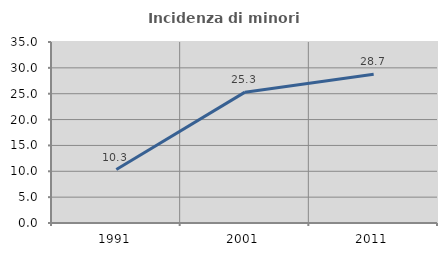
| Category | Incidenza di minori stranieri |
|---|---|
| 1991.0 | 10.345 |
| 2001.0 | 25.301 |
| 2011.0 | 28.745 |